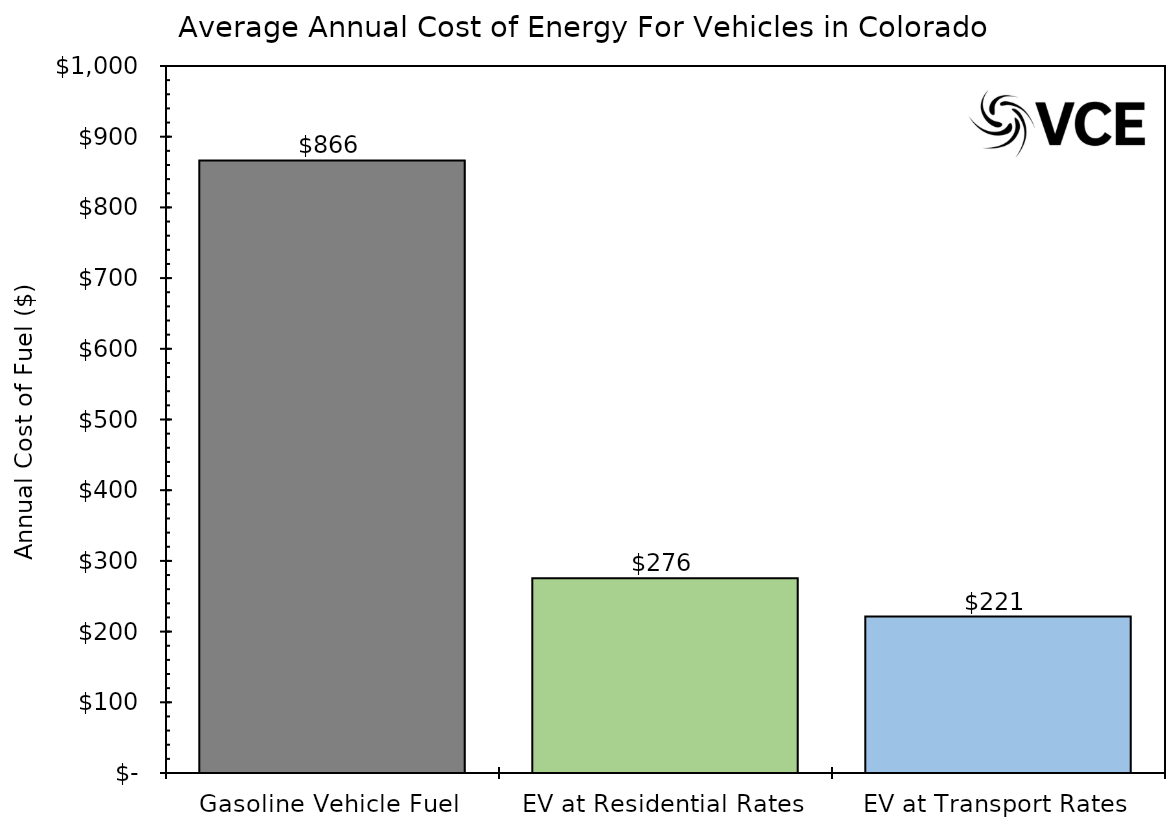
| Category | Series 0 |
|---|---|
| 0 | 866.384 |
| 1 | 275.526 |
| 2 | 221.194 |